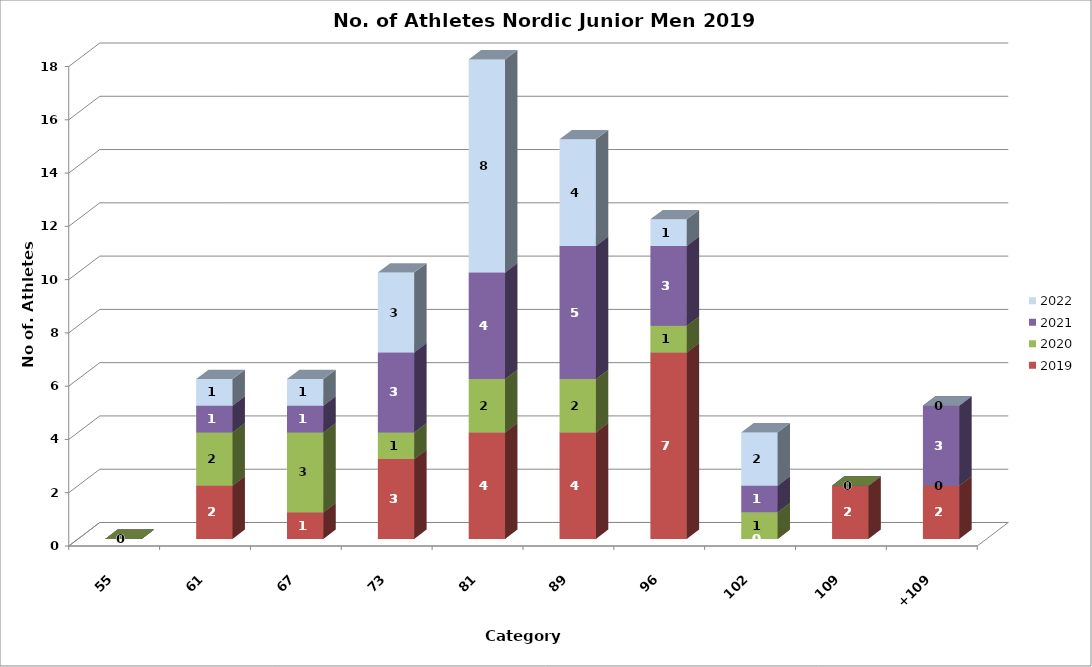
| Category | 2019 | 2020 | 2021 | 2022 |
|---|---|---|---|---|
| 55 | 0 | 0 | 0 | 0 |
| 61 | 2 | 2 | 1 | 1 |
| 67 | 1 | 3 | 1 | 1 |
| 73 | 3 | 1 | 3 | 3 |
| 81 | 4 | 2 | 4 | 8 |
| 89 | 4 | 2 | 5 | 4 |
| 96 | 7 | 1 | 3 | 1 |
| 102 | 0 | 1 | 1 | 2 |
| 109 | 2 | 0 | 0 | 0 |
| +109 | 2 | 0 | 3 | 0 |